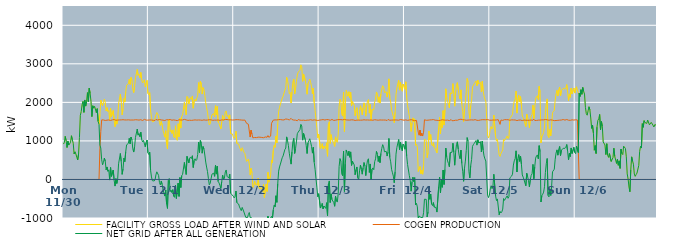
| Category | FACILITY GROSS LOAD AFTER WIND AND SOLAR | COGEN PRODUCTION | NET GRID AFTER ALL GENERATION |
|---|---|---|---|
|  Mon  11/30 | 918 | 0 | 918 |
|  Mon  11/30 | 956 | 0 | 956 |
|  Mon  11/30 | 1117 | 0 | 1117 |
|  Mon  11/30 | 1007 | 0 | 1007 |
|  Mon  11/30 | 829 | 0 | 829 |
|  Mon  11/30 | 993 | 0 | 993 |
|  Mon  11/30 | 892 | 0 | 892 |
|  Mon  11/30 | 909 | 0 | 909 |
|  Mon  11/30 | 962 | 0 | 962 |
|  Mon  11/30 | 1134 | 0 | 1134 |
|  Mon  11/30 | 1029 | 0 | 1029 |
|  Mon  11/30 | 940 | 0 | 940 |
|  Mon  11/30 | 662 | 0 | 662 |
|  Mon  11/30 | 717 | 0 | 717 |
|  Mon  11/30 | 660 | 0 | 660 |
|  Mon  11/30 | 578 | 0 | 578 |
|  Mon  11/30 | 505 | 0 | 505 |
|  Mon  11/30 | 658 | 0 | 658 |
|  Mon  11/30 | 1086 | 0 | 1086 |
|  Mon  11/30 | 1663 | 0 | 1663 |
|  Mon  11/30 | 1763 | 0 | 1763 |
|  Mon  11/30 | 1942 | 0 | 1942 |
|  Mon  11/30 | 2024 | 0 | 2024 |
|  Mon  11/30 | 1741 | 0 | 1741 |
|  Mon  11/30 | 2062 | 0 | 2062 |
|  Mon  11/30 | 1903 | 0 | 1903 |
|  Mon  11/30 | 2024 | 0 | 2024 |
|  Mon  11/30 | 2253 | 0 | 2253 |
|  Mon  11/30 | 2019 | 0 | 2019 |
|  Mon  11/30 | 2367 | 0 | 2367 |
|  Mon  11/30 | 2233 | 0 | 2233 |
|  Mon  11/30 | 2024 | 0 | 2024 |
|  Mon  11/30 | 1630 | 0 | 1630 |
|  Mon  11/30 | 1912 | 0 | 1912 |
|  Mon  11/30 | 1850 | 0 | 1850 |
|  Mon  11/30 | 1897 | 0 | 1897 |
|  Mon  11/30 | 1891 | 0 | 1891 |
|  Mon  11/30 | 1733 | 0 | 1733 |
|  Mon  11/30 | 1836 | 0 | 1836 |
|  Mon  11/30 | 1507 | 0 | 1507 |
|  Mon  11/30 | 1432 | 0 | 1432 |
|  Mon  11/30 | 1687 | 795 | 892 |
|  Mon  11/30 | 2058 | 1243 | 815 |
|  Mon  11/30 | 2057 | 1546 | 511 |
|  Mon  11/30 | 1917 | 1538 | 379 |
|  Mon  11/30 | 1986 | 1544 | 442 |
|  Mon  11/30 | 2083 | 1528 | 555 |
|  Mon  11/30 | 2006 | 1530 | 476 |
|  Mon  11/30 | 1778 | 1528 | 250 |
|  Mon  11/30 | 1862 | 1538 | 324 |
|  Mon  11/30 | 1762 | 1551 | 211 |
|  Mon  11/30 | 1793 | 1543 | 250 |
|  Mon  11/30 | 1535 | 1551 | -16 |
|  Mon  11/30 | 1841 | 1531 | 310 |
|  Mon  11/30 | 1628 | 1549 | 79 |
|  Mon  11/30 | 1616 | 1545 | 71 |
|  Mon  11/30 | 1788 | 1543 | 245 |
|  Mon  11/30 | 1534 | 1555 | -21 |
|  Mon  11/30 | 1369 | 1541 | -172 |
|  Mon  11/30 | 1557 | 1535 | 22 |
|  Mon  11/30 | 1435 | 1539 | -104 |
|  Mon  11/30 | 1555 | 1540 | 15 |
|  Mon  11/30 | 1957 | 1551 | 406 |
|  Mon  11/30 | 1954 | 1544 | 410 |
|  Mon  11/30 | 2217 | 1544 | 673 |
|  Mon  11/30 | 2010 | 1545 | 465 |
|  Mon  11/30 | 1676 | 1544 | 132 |
|  Mon  11/30 | 1823 | 1550 | 273 |
|  Mon  11/30 | 2099 | 1545 | 554 |
|  Mon  11/30 | 2007 | 1544 | 463 |
|  Mon  11/30 | 2268 | 1557 | 711 |
|  Mon  11/30 | 2442 | 1543 | 899 |
|  Mon  11/30 | 2450 | 1548 | 902 |
|  Mon  11/30 | 2482 | 1547 | 935 |
|  Mon  11/30 | 2601 | 1535 | 1066 |
|  Mon  11/30 | 2466 | 1541 | 925 |
|  Mon  11/30 | 2647 | 1547 | 1100 |
|  Mon  11/30 | 2575 | 1542 | 1033 |
|  Mon  11/30 | 2338 | 1543 | 795 |
|  Mon  11/30 | 2253 | 1542 | 711 |
|  Mon  11/30 | 2402 | 1555 | 847 |
|  Mon  11/30 | 2641 | 1549 | 1092 |
|  Mon  11/30 | 2620 | 1543 | 1077 |
|  Mon  11/30 | 2854 | 1546 | 1308 |
|  Mon  11/30 | 2702 | 1553 | 1149 |
|  Mon  11/30 | 2733 | 1540 | 1193 |
|  Mon  11/30 | 2637 | 1528 | 1109 |
|  Mon  11/30 | 2775 | 1550 | 1225 |
|  Mon  11/30 | 2576 | 1541 | 1035 |
|  Mon  11/30 | 2502 | 1529 | 973 |
|  Mon  11/30 | 2546 | 1534 | 1012 |
|  Mon  11/30 | 2587 | 1559 | 1028 |
|  Mon  11/30 | 2404 | 1556 | 848 |
|  Mon  11/30 | 2499 | 1540 | 959 |
|  Mon  11/30 | 2571 | 1548 | 1023 |
|  Mon  11/30 | 2230 | 1539 | 691 |
|  Tue  12/1 | 2197 | 1549 | 648 |
|  Tue  12/1 | 2253 | 1543 | 710 |
|  Tue  12/1 | 1787 | 1550 | 237 |
|  Tue  12/1 | 1607 | 1542 | 65 |
|  Tue  12/1 | 1496 | 1528 | -32 |
|  Tue  12/1 | 1497 | 1535 | -38 |
|  Tue  12/1 | 1511 | 1551 | -40 |
|  Tue  12/1 | 1517 | 1529 | -12 |
|  Tue  12/1 | 1676 | 1556 | 120 |
|  Tue  12/1 | 1737 | 1539 | 198 |
|  Tue  12/1 | 1715 | 1541 | 174 |
|  Tue  12/1 | 1652 | 1547 | 105 |
|  Tue  12/1 | 1474 | 1555 | -81 |
|  Tue  12/1 | 1400 | 1541 | -141 |
|  Tue  12/1 | 1504 | 1544 | -40 |
|  Tue  12/1 | 1414 | 1545 | -131 |
|  Tue  12/1 | 1268 | 1538 | -270 |
|  Tue  12/1 | 1184 | 1541 | -357 |
|  Tue  12/1 | 1098 | 1529 | -431 |
|  Tue  12/1 | 1263 | 1535 | -272 |
|  Tue  12/1 | 912 | 1550 | -638 |
|  Tue  12/1 | 789 | 1541 | -752 |
|  Tue  12/1 | 1524 | 1546 | -22 |
|  Tue  12/1 | 1568 | 1543 | 25 |
|  Tue  12/1 | 1238 | 1555 | -317 |
|  Tue  12/1 | 1285 | 1560 | -275 |
|  Tue  12/1 | 1194 | 1537 | -343 |
|  Tue  12/1 | 1286 | 1549 | -263 |
|  Tue  12/1 | 1110 | 1545 | -435 |
|  Tue  12/1 | 1080 | 1544 | -464 |
|  Tue  12/1 | 1392 | 1536 | -144 |
|  Tue  12/1 | 1051 | 1545 | -494 |
|  Tue  12/1 | 1014 | 1527 | -513 |
|  Tue  12/1 | 1447 | 1543 | -96 |
|  Tue  12/1 | 1109 | 1548 | -439 |
|  Tue  12/1 | 1591 | 1541 | 50 |
|  Tue  12/1 | 1332 | 1542 | -210 |
|  Tue  12/1 | 1636 | 1538 | 98 |
|  Tue  12/1 | 1675 | 1543 | 132 |
|  Tue  12/1 | 1683 | 1542 | 141 |
|  Tue  12/1 | 1999 | 1558 | 441 |
|  Tue  12/1 | 1815 | 1539 | 276 |
|  Tue  12/1 | 1673 | 1545 | 128 |
|  Tue  12/1 | 2153 | 1554 | 599 |
|  Tue  12/1 | 2127 | 1533 | 594 |
|  Tue  12/1 | 1956 | 1525 | 431 |
|  Tue  12/1 | 2086 | 1537 | 549 |
|  Tue  12/1 | 2126 | 1542 | 584 |
|  Tue  12/1 | 2077 | 1533 | 544 |
|  Tue  12/1 | 2166 | 1551 | 615 |
|  Tue  12/1 | 1849 | 1539 | 310 |
|  Tue  12/1 | 2026 | 1534 | 492 |
|  Tue  12/1 | 2082 | 1545 | 537 |
|  Tue  12/1 | 2033 | 1545 | 488 |
|  Tue  12/1 | 2058 | 1540 | 518 |
|  Tue  12/1 | 2185 | 1538 | 647 |
|  Tue  12/1 | 2513 | 1543 | 970 |
|  Tue  12/1 | 2242 | 1544 | 698 |
|  Tue  12/1 | 2551 | 1541 | 1010 |
|  Tue  12/1 | 2478 | 1543 | 935 |
|  Tue  12/1 | 2216 | 1535 | 681 |
|  Tue  12/1 | 2385 | 1531 | 854 |
|  Tue  12/1 | 2337 | 1546 | 791 |
|  Tue  12/1 | 2178 | 1544 | 634 |
|  Tue  12/1 | 1989 | 1538 | 451 |
|  Tue  12/1 | 1861 | 1539 | 322 |
|  Tue  12/1 | 1747 | 1541 | 206 |
|  Tue  12/1 | 1569 | 1539 | 30 |
|  Tue  12/1 | 1412 | 1550 | -138 |
|  Tue  12/1 | 1441 | 1543 | -102 |
|  Tue  12/1 | 1464 | 1546 | -82 |
|  Tue  12/1 | 1678 | 1541 | 137 |
|  Tue  12/1 | 1677 | 1534 | 143 |
|  Tue  12/1 | 1708 | 1544 | 164 |
|  Tue  12/1 | 1621 | 1540 | 81 |
|  Tue  12/1 | 1913 | 1545 | 368 |
|  Tue  12/1 | 1678 | 1539 | 139 |
|  Tue  12/1 | 1896 | 1550 | 346 |
|  Tue  12/1 | 1489 | 1543 | -54 |
|  Tue  12/1 | 1451 | 1541 | -90 |
|  Tue  12/1 | 1375 | 1533 | -158 |
|  Tue  12/1 | 1311 | 1543 | -232 |
|  Tue  12/1 | 1488 | 1544 | -56 |
|  Tue  12/1 | 1658 | 1547 | 111 |
|  Tue  12/1 | 1529 | 1543 | -14 |
|  Tue  12/1 | 1573 | 1538 | 35 |
|  Tue  12/1 | 1752 | 1557 | 195 |
|  Tue  12/1 | 1779 | 1533 | 246 |
|  Tue  12/1 | 1636 | 1554 | 82 |
|  Tue  12/1 | 1666 | 1561 | 105 |
|  Tue  12/1 | 1581 | 1546 | 35 |
|  Tue  12/1 | 1676 | 1537 | 139 |
|  Tue  12/1 | 1190 | 1547 | -357 |
|  Tue  12/1 | 1175 | 1558 | -383 |
|  Tue  12/1 | 1181 | 1542 | -361 |
|  Tue  12/1 | 1109 | 1543 | -434 |
|  Wed  12/2 | 1066 | 1544 | -478 |
|  Wed  12/2 | 1106 | 1544 | -438 |
|  Wed  12/2 | 1251 | 1551 | -300 |
|  Wed  12/2 | 934 | 1535 | -601 |
|  Wed  12/2 | 946 | 1551 | -605 |
|  Wed  12/2 | 918 | 1555 | -637 |
|  Wed  12/2 | 834 | 1547 | -713 |
|  Wed  12/2 | 816 | 1527 | -711 |
|  Wed  12/2 | 732 | 1542 | -810 |
|  Wed  12/2 | 824 | 1549 | -725 |
|  Wed  12/2 | 818 | 1538 | -720 |
|  Wed  12/2 | 706 | 1552 | -846 |
|  Wed  12/2 | 672 | 1541 | -869 |
|  Wed  12/2 | 553 | 1536 | -983 |
|  Wed  12/2 | 468 | 1455 | -987 |
|  Wed  12/2 | 458 | 1445 | -987 |
|  Wed  12/2 | 525 | 1432 | -907 |
|  Wed  12/2 | 400 | 1257 | -857 |
|  Wed  12/2 | 114 | 1101 | -987 |
|  Wed  12/2 | 290 | 1279 | -989 |
|  Wed  12/2 | 171 | 1173 | -1002 |
|  Wed  12/2 | -213 | 1080 | -1293 |
|  Wed  12/2 | -171 | 1098 | -1269 |
|  Wed  12/2 | -52 | 1088 | -1140 |
|  Wed  12/2 | -140 | 1097 | -1237 |
|  Wed  12/2 | -113 | 1086 | -1199 |
|  Wed  12/2 | -155 | 1090 | -1245 |
|  Wed  12/2 | 35 | 1097 | -1062 |
|  Wed  12/2 | -207 | 1093 | -1300 |
|  Wed  12/2 | -251 | 1096 | -1347 |
|  Wed  12/2 | -205 | 1106 | -1311 |
|  Wed  12/2 | -257 | 1090 | -1347 |
|  Wed  12/2 | -314 | 1082 | -1396 |
|  Wed  12/2 | -125 | 1082 | -1207 |
|  Wed  12/2 | -468 | 1081 | -1549 |
|  Wed  12/2 | -454 | 1103 | -1557 |
|  Wed  12/2 | -121 | 1090 | -1211 |
|  Wed  12/2 | -311 | 1095 | -1406 |
|  Wed  12/2 | 186 | 1138 | -952 |
|  Wed  12/2 | -72 | 1094 | -1166 |
|  Wed  12/2 | -70 | 1094 | -1164 |
|  Wed  12/2 | 127 | 1124 | -997 |
|  Wed  12/2 | 501 | 1458 | -957 |
|  Wed  12/2 | 435 | 1455 | -1020 |
|  Wed  12/2 | 756 | 1540 | -784 |
|  Wed  12/2 | 889 | 1551 | -662 |
|  Wed  12/2 | 833 | 1545 | -712 |
|  Wed  12/2 | 1125 | 1548 | -423 |
|  Wed  12/2 | 950 | 1544 | -594 |
|  Wed  12/2 | 1446 | 1555 | -109 |
|  Wed  12/2 | 1767 | 1551 | 216 |
|  Wed  12/2 | 1865 | 1540 | 325 |
|  Wed  12/2 | 1954 | 1554 | 400 |
|  Wed  12/2 | 1951 | 1544 | 407 |
|  Wed  12/2 | 2107 | 1545 | 562 |
|  Wed  12/2 | 2157 | 1547 | 610 |
|  Wed  12/2 | 2156 | 1544 | 612 |
|  Wed  12/2 | 2316 | 1541 | 775 |
|  Wed  12/2 | 2383 | 1569 | 814 |
|  Wed  12/2 | 2651 | 1547 | 1104 |
|  Wed  12/2 | 2569 | 1561 | 1008 |
|  Wed  12/2 | 2425 | 1549 | 876 |
|  Wed  12/2 | 2224 | 1544 | 680 |
|  Wed  12/2 | 2256 | 1561 | 695 |
|  Wed  12/2 | 1983 | 1585 | 398 |
|  Wed  12/2 | 2273 | 1555 | 718 |
|  Wed  12/2 | 2526 | 1548 | 978 |
|  Wed  12/2 | 2606 | 1540 | 1066 |
|  Wed  12/2 | 2220 | 1544 | 676 |
|  Wed  12/2 | 2340 | 1539 | 801 |
|  Wed  12/2 | 2537 | 1564 | 973 |
|  Wed  12/2 | 2710 | 1523 | 1187 |
|  Wed  12/2 | 2782 | 1554 | 1228 |
|  Wed  12/2 | 2777 | 1543 | 1234 |
|  Wed  12/2 | 2833 | 1539 | 1294 |
|  Wed  12/2 | 2974 | 1544 | 1430 |
|  Wed  12/2 | 2923 | 1535 | 1388 |
|  Wed  12/2 | 2546 | 1526 | 1020 |
|  Wed  12/2 | 2737 | 1538 | 1199 |
|  Wed  12/2 | 2746 | 1543 | 1203 |
|  Wed  12/2 | 2558 | 1531 | 1027 |
|  Wed  12/2 | 2419 | 1534 | 885 |
|  Wed  12/2 | 2212 | 1539 | 673 |
|  Wed  12/2 | 2488 | 1541 | 947 |
|  Wed  12/2 | 2544 | 1539 | 1005 |
|  Wed  12/2 | 2606 | 1550 | 1056 |
|  Wed  12/2 | 2514 | 1550 | 964 |
|  Wed  12/2 | 2404 | 1545 | 859 |
|  Wed  12/2 | 2220 | 1537 | 683 |
|  Wed  12/2 | 2371 | 1537 | 834 |
|  Wed  12/2 | 1992 | 1546 | 446 |
|  Wed  12/2 | 1793 | 1530 | 263 |
|  Wed  12/2 | 1563 | 1540 | 23 |
|  Wed  12/2 | 1347 | 1546 | -199 |
|  Wed  12/2 | 1081 | 1530 | -449 |
|  Wed  12/2 | 1177 | 1547 | -370 |
|  Thu  12/3 | 1165 | 1539 | -374 |
|  Thu  12/3 | 800 | 1542 | -742 |
|  Thu  12/3 | 844 | 1546 | -702 |
|  Thu  12/3 | 928 | 1549 | -621 |
|  Thu  12/3 | 788 | 1553 | -765 |
|  Thu  12/3 | 868 | 1558 | -690 |
|  Thu  12/3 | 825 | 1542 | -717 |
|  Thu  12/3 | 795 | 1546 | -751 |
|  Thu  12/3 | 951 | 1553 | -602 |
|  Thu  12/3 | 603 | 1544 | -941 |
|  Thu  12/3 | 1434 | 1551 | -117 |
|  Thu  12/3 | 1499 | 1538 | -39 |
|  Thu  12/3 | 937 | 1535 | -598 |
|  Thu  12/3 | 1162 | 1536 | -374 |
|  Thu  12/3 | 1030 | 1556 | -526 |
|  Thu  12/3 | 1012 | 1532 | -520 |
|  Thu  12/3 | 932 | 1532 | -600 |
|  Thu  12/3 | 858 | 1554 | -696 |
|  Thu  12/3 | 1104 | 1538 | -434 |
|  Thu  12/3 | 988 | 1546 | -558 |
|  Thu  12/3 | 962 | 1549 | -587 |
|  Thu  12/3 | 1176 | 1538 | -362 |
|  Thu  12/3 | 1888 | 1552 | 336 |
|  Thu  12/3 | 2076 | 1536 | 540 |
|  Thu  12/3 | 2021 | 1552 | 469 |
|  Thu  12/3 | 1692 | 1549 | 143 |
|  Thu  12/3 | 1644 | 1546 | 98 |
|  Thu  12/3 | 2268 | 1533 | 735 |
|  Thu  12/3 | 1243 | 1557 | -314 |
|  Thu  12/3 | 1954 | 1555 | 399 |
|  Thu  12/3 | 2310 | 1545 | 765 |
|  Thu  12/3 | 2235 | 1538 | 697 |
|  Thu  12/3 | 2159 | 1542 | 617 |
|  Thu  12/3 | 2275 | 1544 | 731 |
|  Thu  12/3 | 2116 | 1540 | 576 |
|  Thu  12/3 | 2261 | 1546 | 715 |
|  Thu  12/3 | 1911 | 1547 | 364 |
|  Thu  12/3 | 2024 | 1549 | 475 |
|  Thu  12/3 | 2016 | 1544 | 472 |
|  Thu  12/3 | 1928 | 1550 | 378 |
|  Thu  12/3 | 1653 | 1531 | 122 |
|  Thu  12/3 | 1794 | 1541 | 253 |
|  Thu  12/3 | 1863 | 1539 | 324 |
|  Thu  12/3 | 1579 | 1536 | 43 |
|  Thu  12/3 | 1535 | 1540 | -5 |
|  Thu  12/3 | 1769 | 1546 | 223 |
|  Thu  12/3 | 1912 | 1538 | 374 |
|  Thu  12/3 | 1805 | 1542 | 263 |
|  Thu  12/3 | 1677 | 1540 | 137 |
|  Thu  12/3 | 1851 | 1545 | 306 |
|  Thu  12/3 | 1987 | 1548 | 439 |
|  Thu  12/3 | 1891 | 1539 | 352 |
|  Thu  12/3 | 1642 | 1542 | 100 |
|  Thu  12/3 | 1911 | 1548 | 363 |
|  Thu  12/3 | 2041 | 1544 | 497 |
|  Thu  12/3 | 2074 | 1537 | 537 |
|  Thu  12/3 | 1721 | 1540 | 181 |
|  Thu  12/3 | 1948 | 1546 | 402 |
|  Thu  12/3 | 1531 | 1543 | -12 |
|  Thu  12/3 | 1815 | 1546 | 269 |
|  Thu  12/3 | 1836 | 1536 | 300 |
|  Thu  12/3 | 1807 | 1554 | 253 |
|  Thu  12/3 | 2011 | 1550 | 461 |
|  Thu  12/3 | 2081 | 1546 | 535 |
|  Thu  12/3 | 2270 | 1543 | 727 |
|  Thu  12/3 | 2201 | 1549 | 652 |
|  Thu  12/3 | 2002 | 1537 | 465 |
|  Thu  12/3 | 2144 | 1535 | 609 |
|  Thu  12/3 | 1981 | 1544 | 437 |
|  Thu  12/3 | 2219 | 1544 | 675 |
|  Thu  12/3 | 2347 | 1541 | 806 |
|  Thu  12/3 | 2431 | 1528 | 903 |
|  Thu  12/3 | 2392 | 1542 | 850 |
|  Thu  12/3 | 2253 | 1536 | 717 |
|  Thu  12/3 | 2260 | 1541 | 719 |
|  Thu  12/3 | 2274 | 1545 | 729 |
|  Thu  12/3 | 2137 | 1530 | 607 |
|  Thu  12/3 | 2264 | 1556 | 708 |
|  Thu  12/3 | 2610 | 1547 | 1063 |
|  Thu  12/3 | 2106 | 1536 | 570 |
|  Thu  12/3 | 2008 | 1550 | 458 |
|  Thu  12/3 | 1801 | 1539 | 262 |
|  Thu  12/3 | 1721 | 1548 | 173 |
|  Thu  12/3 | 1628 | 1542 | 86 |
|  Thu  12/3 | 1472 | 1558 | -86 |
|  Thu  12/3 | 1745 | 1544 | 201 |
|  Thu  12/3 | 2206 | 1550 | 656 |
|  Thu  12/3 | 2375 | 1542 | 833 |
|  Thu  12/3 | 2371 | 1544 | 827 |
|  Thu  12/3 | 2573 | 1537 | 1036 |
|  Thu  12/3 | 2318 | 1545 | 773 |
|  Thu  12/3 | 2526 | 1555 | 971 |
|  Thu  12/3 | 2366 | 1544 | 822 |
|  Thu  12/3 | 2289 | 1546 | 743 |
|  Thu  12/3 | 2476 | 1558 | 918 |
|  Thu  12/3 | 2417 | 1537 | 880 |
|  Fri  12/4 | 2341 | 1556 | 785 |
|  Fri  12/4 | 2533 | 1546 | 987 |
|  Fri  12/4 | 2139 | 1532 | 607 |
|  Fri  12/4 | 1920 | 1533 | 387 |
|  Fri  12/4 | 1930 | 1547 | 383 |
|  Fri  12/4 | 1640 | 1543 | 97 |
|  Fri  12/4 | 1512 | 1535 | -23 |
|  Fri  12/4 | 1246 | 1550 | -304 |
|  Fri  12/4 | 1469 | 1535 | -66 |
|  Fri  12/4 | 1598 | 1539 | 59 |
|  Fri  12/4 | 1491 | 1545 | -54 |
|  Fri  12/4 | 1571 | 1524 | 47 |
|  Fri  12/4 | 885 | 1544 | -659 |
|  Fri  12/4 | 913 | 1532 | -619 |
|  Fri  12/4 | 837 | 1549 | -712 |
|  Fri  12/4 | 207 | 1229 | -1022 |
|  Fri  12/4 | 200 | 1148 | -948 |
|  Fri  12/4 | 334 | 1281 | -947 |
|  Fri  12/4 | 148 | 1133 | -985 |
|  Fri  12/4 | 237 | 1201 | -964 |
|  Fri  12/4 | 136 | 1126 | -990 |
|  Fri  12/4 | 363 | 1226 | -863 |
|  Fri  12/4 | 1037 | 1549 | -512 |
|  Fri  12/4 | 1030 | 1549 | -519 |
|  Fri  12/4 | 1017 | 1535 | -518 |
|  Fri  12/4 | 565 | 1537 | -972 |
|  Fri  12/4 | 694 | 1538 | -844 |
|  Fri  12/4 | 1257 | 1529 | -272 |
|  Fri  12/4 | 1029 | 1544 | -515 |
|  Fri  12/4 | 1164 | 1544 | -380 |
|  Fri  12/4 | 908 | 1547 | -639 |
|  Fri  12/4 | 874 | 1551 | -677 |
|  Fri  12/4 | 954 | 1553 | -599 |
|  Fri  12/4 | 830 | 1548 | -718 |
|  Fri  12/4 | 801 | 1538 | -737 |
|  Fri  12/4 | 817 | 1544 | -727 |
|  Fri  12/4 | 689 | 1535 | -846 |
|  Fri  12/4 | 709 | 1546 | -837 |
|  Fri  12/4 | 1349 | 1529 | -180 |
|  Fri  12/4 | 1610 | 1548 | 62 |
|  Fri  12/4 | 1186 | 1536 | -350 |
|  Fri  12/4 | 1541 | 1535 | 6 |
|  Fri  12/4 | 1345 | 1549 | -204 |
|  Fri  12/4 | 1786 | 1542 | 244 |
|  Fri  12/4 | 1410 | 1541 | -131 |
|  Fri  12/4 | 1802 | 1543 | 259 |
|  Fri  12/4 | 2352 | 1537 | 815 |
|  Fri  12/4 | 2131 | 1545 | 586 |
|  Fri  12/4 | 2022 | 1540 | 482 |
|  Fri  12/4 | 1951 | 1538 | 413 |
|  Fri  12/4 | 1857 | 1527 | 330 |
|  Fri  12/4 | 2244 | 1545 | 699 |
|  Fri  12/4 | 2231 | 1552 | 679 |
|  Fri  12/4 | 2229 | 1523 | 706 |
|  Fri  12/4 | 2486 | 1547 | 939 |
|  Fri  12/4 | 2229 | 1527 | 702 |
|  Fri  12/4 | 1901 | 1531 | 370 |
|  Fri  12/4 | 2236 | 1537 | 699 |
|  Fri  12/4 | 2455 | 1552 | 903 |
|  Fri  12/4 | 2512 | 1536 | 976 |
|  Fri  12/4 | 2323 | 1540 | 783 |
|  Fri  12/4 | 2181 | 1555 | 626 |
|  Fri  12/4 | 2086 | 1547 | 539 |
|  Fri  12/4 | 2324 | 1563 | 761 |
|  Fri  12/4 | 1952 | 1538 | 414 |
|  Fri  12/4 | 1762 | 1550 | 212 |
|  Fri  12/4 | 1502 | 1550 | -48 |
|  Fri  12/4 | 1832 | 1546 | 286 |
|  Fri  12/4 | 2017 | 1541 | 476 |
|  Fri  12/4 | 2287 | 1536 | 751 |
|  Fri  12/4 | 2620 | 1534 | 1086 |
|  Fri  12/4 | 2531 | 1540 | 991 |
|  Fri  12/4 | 1759 | 1559 | 200 |
|  Fri  12/4 | 1583 | 1544 | 39 |
|  Fri  12/4 | 1906 | 1545 | 361 |
|  Fri  12/4 | 2064 | 1546 | 518 |
|  Fri  12/4 | 2399 | 1540 | 859 |
|  Fri  12/4 | 2445 | 1542 | 903 |
|  Fri  12/4 | 2484 | 1548 | 936 |
|  Fri  12/4 | 2473 | 1552 | 921 |
|  Fri  12/4 | 2556 | 1546 | 1010 |
|  Fri  12/4 | 2426 | 1535 | 891 |
|  Fri  12/4 | 2575 | 1546 | 1029 |
|  Fri  12/4 | 2479 | 1533 | 946 |
|  Fri  12/4 | 2484 | 1550 | 934 |
|  Fri  12/4 | 2521 | 1543 | 978 |
|  Fri  12/4 | 2270 | 1557 | 713 |
|  Fri  12/4 | 2545 | 1550 | 995 |
|  Fri  12/4 | 2295 | 1541 | 754 |
|  Fri  12/4 | 2161 | 1550 | 611 |
|  Fri  12/4 | 2082 | 1549 | 533 |
|  Fri  12/4 | 2026 | 1548 | 478 |
|  Fri  12/4 | 1587 | 1545 | 42 |
|  Fri  12/4 | 1151 | 1555 | -404 |
|  Fri  12/4 | 1076 | 1547 | -471 |
|  Fri  12/4 | 1132 | 1538 | -406 |
|  Sat  12/5 | 1315 | 1560 | -245 |
|  Sat  12/5 | 1373 | 1536 | -163 |
|  Sat  12/5 | 1306 | 1547 | -241 |
|  Sat  12/5 | 1364 | 1542 | -178 |
|  Sat  12/5 | 1672 | 1538 | 134 |
|  Sat  12/5 | 1693 | 1542 | 151 |
|  Sat  12/5 | 1114 | 1545 | -431 |
|  Sat  12/5 | 995 | 1544 | -549 |
|  Sat  12/5 | 1042 | 1547 | -505 |
|  Sat  12/5 | 1061 | 1551 | -490 |
|  Sat  12/5 | 635 | 1551 | -916 |
|  Sat  12/5 | 596 | 1429 | -833 |
|  Sat  12/5 | 674 | 1542 | -868 |
|  Sat  12/5 | 699 | 1538 | -839 |
|  Sat  12/5 | 764 | 1533 | -769 |
|  Sat  12/5 | 1046 | 1540 | -494 |
|  Sat  12/5 | 1008 | 1551 | -543 |
|  Sat  12/5 | 1037 | 1539 | -502 |
|  Sat  12/5 | 1027 | 1550 | -523 |
|  Sat  12/5 | 1129 | 1553 | -424 |
|  Sat  12/5 | 1060 | 1549 | -489 |
|  Sat  12/5 | 1103 | 1546 | -443 |
|  Sat  12/5 | 1577 | 1536 | 41 |
|  Sat  12/5 | 1615 | 1557 | 58 |
|  Sat  12/5 | 1633 | 1546 | 87 |
|  Sat  12/5 | 1687 | 1549 | 138 |
|  Sat  12/5 | 1918 | 1544 | 374 |
|  Sat  12/5 | 2036 | 1553 | 483 |
|  Sat  12/5 | 2086 | 1543 | 543 |
|  Sat  12/5 | 2293 | 1550 | 743 |
|  Sat  12/5 | 1722 | 1528 | 194 |
|  Sat  12/5 | 2079 | 1546 | 533 |
|  Sat  12/5 | 2184 | 1540 | 644 |
|  Sat  12/5 | 2016 | 1547 | 469 |
|  Sat  12/5 | 2150 | 1542 | 608 |
|  Sat  12/5 | 1938 | 1540 | 398 |
|  Sat  12/5 | 1644 | 1528 | 116 |
|  Sat  12/5 | 1606 | 1546 | 60 |
|  Sat  12/5 | 1536 | 1542 | -6 |
|  Sat  12/5 | 1439 | 1530 | -91 |
|  Sat  12/5 | 1373 | 1537 | -164 |
|  Sat  12/5 | 1698 | 1538 | 160 |
|  Sat  12/5 | 1605 | 1534 | 71 |
|  Sat  12/5 | 1520 | 1548 | -28 |
|  Sat  12/5 | 1344 | 1537 | -193 |
|  Sat  12/5 | 1538 | 1544 | -6 |
|  Sat  12/5 | 1645 | 1540 | 105 |
|  Sat  12/5 | 1680 | 1532 | 148 |
|  Sat  12/5 | 1928 | 1538 | 390 |
|  Sat  12/5 | 1583 | 1564 | 19 |
|  Sat  12/5 | 1857 | 1530 | 327 |
|  Sat  12/5 | 2092 | 1539 | 553 |
|  Sat  12/5 | 2142 | 1531 | 611 |
|  Sat  12/5 | 2173 | 1536 | 637 |
|  Sat  12/5 | 2075 | 1539 | 536 |
|  Sat  12/5 | 2415 | 1538 | 877 |
|  Sat  12/5 | 2264 | 1541 | 723 |
|  Sat  12/5 | 948 | 1533 | -585 |
|  Sat  12/5 | 1125 | 1545 | -420 |
|  Sat  12/5 | 1154 | 1538 | -384 |
|  Sat  12/5 | 1218 | 1546 | -328 |
|  Sat  12/5 | 1359 | 1547 | -188 |
|  Sat  12/5 | 1739 | 1555 | 184 |
|  Sat  12/5 | 1957 | 1546 | 411 |
|  Sat  12/5 | 2090 | 1547 | 543 |
|  Sat  12/5 | 1131 | 1545 | -414 |
|  Sat  12/5 | 1083 | 1536 | -453 |
|  Sat  12/5 | 1297 | 1555 | -258 |
|  Sat  12/5 | 1133 | 1547 | -414 |
|  Sat  12/5 | 1381 | 1549 | -168 |
|  Sat  12/5 | 1736 | 1538 | 198 |
|  Sat  12/5 | 1738 | 1536 | 202 |
|  Sat  12/5 | 1792 | 1526 | 266 |
|  Sat  12/5 | 2060 | 1535 | 525 |
|  Sat  12/5 | 2215 | 1529 | 686 |
|  Sat  12/5 | 2312 | 1545 | 767 |
|  Sat  12/5 | 2164 | 1534 | 630 |
|  Sat  12/5 | 2327 | 1549 | 778 |
|  Sat  12/5 | 2395 | 1539 | 856 |
|  Sat  12/5 | 2165 | 1546 | 619 |
|  Sat  12/5 | 2302 | 1542 | 760 |
|  Sat  12/5 | 2296 | 1549 | 747 |
|  Sat  12/5 | 2363 | 1555 | 808 |
|  Sat  12/5 | 2360 | 1550 | 810 |
|  Sat  12/5 | 2348 | 1540 | 808 |
|  Sat  12/5 | 2375 | 1540 | 835 |
|  Sat  12/5 | 2461 | 1555 | 906 |
|  Sat  12/5 | 2267 | 1541 | 726 |
|  Sat  12/5 | 2045 | 1537 | 508 |
|  Sat  12/5 | 2220 | 1539 | 681 |
|  Sat  12/5 | 2129 | 1534 | 595 |
|  Sat  12/5 | 2368 | 1551 | 817 |
|  Sat  12/5 | 2220 | 1547 | 673 |
|  Sat  12/5 | 2196 | 1536 | 660 |
|  Sat  12/5 | 2373 | 1541 | 832 |
|  Sat  12/5 | 2241 | 1541 | 700 |
|  Sun  12/6 | 2217 | 1548 | 669 |
|  Sun  12/6 | 2404 | 1538 | 866 |
|  Sun  12/6 | 2403 | 1543 | 860 |
|  Sun  12/6 | 2248 | 1549 | 699 |
|  Sun  12/6 | 2235 | 0 | 2235 |
|  Sun  12/6 | 2153 | 0 | 2153 |
|  Sun  12/6 | 2329 | 0 | 2329 |
|  Sun  12/6 | 2209 | 0 | 2209 |
|  Sun  12/6 | 2387 | 0 | 2387 |
|  Sun  12/6 | 2282 | 0 | 2282 |
|  Sun  12/6 | 2215 | 0 | 2215 |
|  Sun  12/6 | 1872 | 0 | 1872 |
|  Sun  12/6 | 1708 | 0 | 1708 |
|  Sun  12/6 | 1667 | 0 | 1667 |
|  Sun  12/6 | 1779 | 0 | 1779 |
|  Sun  12/6 | 1886 | 0 | 1886 |
|  Sun  12/6 | 1809 | 0 | 1809 |
|  Sun  12/6 | 1594 | 0 | 1594 |
|  Sun  12/6 | 1325 | 0 | 1325 |
|  Sun  12/6 | 1406 | 0 | 1406 |
|  Sun  12/6 | 1201 | 0 | 1201 |
|  Sun  12/6 | 758 | 0 | 758 |
|  Sun  12/6 | 879 | 0 | 879 |
|  Sun  12/6 | 673 | 0 | 673 |
|  Sun  12/6 | 1358 | 0 | 1358 |
|  Sun  12/6 | 1533 | 0 | 1533 |
|  Sun  12/6 | 1572 | 0 | 1572 |
|  Sun  12/6 | 1686 | 0 | 1686 |
|  Sun  12/6 | 1286 | 0 | 1286 |
|  Sun  12/6 | 1503 | 0 | 1503 |
|  Sun  12/6 | 1381 | 0 | 1381 |
|  Sun  12/6 | 974 | 0 | 974 |
|  Sun  12/6 | 969 | 0 | 969 |
|  Sun  12/6 | 894 | 0 | 894 |
|  Sun  12/6 | 646 | 0 | 646 |
|  Sun  12/6 | 927 | 0 | 927 |
|  Sun  12/6 | 634 | 0 | 634 |
|  Sun  12/6 | 573 | 0 | 573 |
|  Sun  12/6 | 671 | 0 | 671 |
|  Sun  12/6 | 686 | 0 | 686 |
|  Sun  12/6 | 467 | 0 | 467 |
|  Sun  12/6 | 455 | 0 | 455 |
|  Sun  12/6 | 566 | 0 | 566 |
|  Sun  12/6 | 811 | 0 | 811 |
|  Sun  12/6 | 597 | 0 | 597 |
|  Sun  12/6 | 616 | 0 | 616 |
|  Sun  12/6 | 417 | 0 | 417 |
|  Sun  12/6 | 522 | 0 | 522 |
|  Sun  12/6 | 368 | 0 | 368 |
|  Sun  12/6 | 482 | 0 | 482 |
|  Sun  12/6 | 287 | 0 | 287 |
|  Sun  12/6 | 789 | 0 | 789 |
|  Sun  12/6 | 674 | 0 | 674 |
|  Sun  12/6 | 645 | 0 | 645 |
|  Sun  12/6 | 863 | 0 | 863 |
|  Sun  12/6 | 854 | 0 | 854 |
|  Sun  12/6 | 804 | 0 | 804 |
|  Sun  12/6 | 587 | 0 | 587 |
|  Sun  12/6 | 145 | 0 | 145 |
|  Sun  12/6 | 13 | 0 | 13 |
|  Sun  12/6 | -196 | 0 | -196 |
|  Sun  12/6 | -319 | 0 | -319 |
|  Sun  12/6 | 247 | 0 | 247 |
|  Sun  12/6 | 587 | 0 | 587 |
|  Sun  12/6 | 481 | 0 | 481 |
|  Sun  12/6 | 396 | 0 | 396 |
|  Sun  12/6 | 140 | 0 | 140 |
|  Sun  12/6 | 81 | 0 | 81 |
|  Sun  12/6 | 126 | 0 | 126 |
|  Sun  12/6 | 166 | 0 | 166 |
|  Sun  12/6 | 187 | 0 | 187 |
|  Sun  12/6 | 363 | 0 | 363 |
|  Sun  12/6 | 730 | 0 | 730 |
|  Sun  12/6 | 861 | 0 | 861 |
|  Sun  12/6 | 815 | 0 | 815 |
|  Sun  12/6 | 1447 | 0 | 1447 |
|  Sun  12/6 | 1353 | 0 | 1353 |
|  Sun  12/6 | 1526 | 0 | 1526 |
|  Sun  12/6 | 1476 | 0 | 1476 |
|  Sun  12/6 | 1487 | 0 | 1487 |
|  Sun  12/6 | 1453 | 0 | 1453 |
|  Sun  12/6 | 1541 | 0 | 1541 |
|  Sun  12/6 | 1526 | 0 | 1526 |
|  Sun  12/6 | 1417 | 0 | 1417 |
|  Sun  12/6 | 1422 | 0 | 1422 |
|  Sun  12/6 | 1481 | 0 | 1481 |
|  Sun  12/6 | 1465 | 0 | 1465 |
|  Sun  12/6 | 1408 | 0 | 1408 |
|  Sun  12/6 | 1361 | 0 | 1361 |
|  Sun  12/6 | 1421 | 0 | 1421 |
|  Sun  12/6 | 1411 | 0 | 1411 |
|  Sun  12/6 | 1407 | 0 | 1407 |